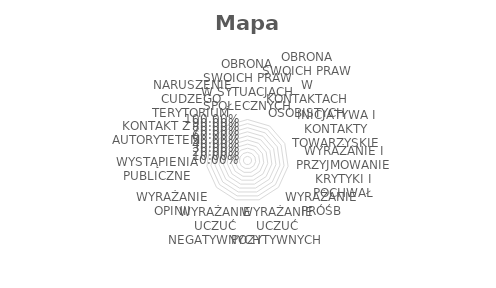
| Category | Series 1 |
|---|---|
| OBRONA SWOICH PRAW W SYTUACJACH SPOŁECZNYCH | 0 |
| OBRONA SWOICH PRAW W KONTAKTACH OSOBISTYCH | 0 |
| INICJATYWA I KONTAKTY TOWARZYSKIE | 0 |
| WYRAŻANIE I PRZYJMOWANIE KRYTYKI I POCHWAŁ | 0 |
| WYRAŻANIE PRÓŚB | 0 |
| WYRAŻANIE UCZUĆ POZYTYWNYCH | 0 |
| WYRAŻANIE UCZUĆ NEGATYWNYCH | 0 |
| WYRAŻANIE OPINII | 0 |
| WYSTĄPIENIA PUBLICZNE | 0 |
| KONTAKT Z AUTORYTETEM | 0 |
| NARUSZENIE CUDZEGO TERYTORIUM | 0 |